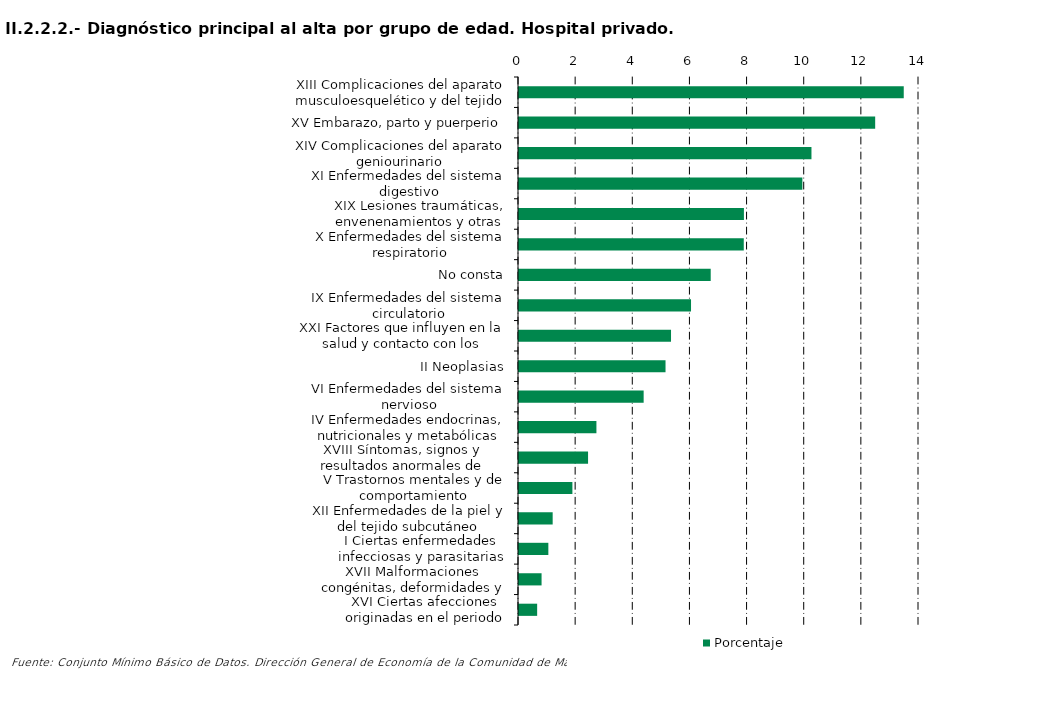
| Category | Porcentaje |
|---|---|
| XIII Complicaciones del aparato musculoesquelético y del tejido conectivo | 13.466 |
| XV Embarazo, parto y puerperio | 12.466 |
| XIV Complicaciones del aparato geniourinario | 10.236 |
| XI Enfermedades del sistema digestivo | 9.918 |
| XIX Lesiones traumáticas, envenenamientos y otras consecuencias de causas externas | 7.872 |
| X Enfermedades del sistema respiratorio | 7.867 |
| No consta | 6.71 |
| IX Enfermedades del sistema circulatorio | 6.021 |
| XXI Factores que influyen en la salud y contacto con los servicios sanitarios | 5.321 |
| II Neoplasias | 5.128 |
| VI Enfermedades del sistema nervioso | 4.363 |
| IV Enfermedades endocrinas, nutricionales y metabólicas | 2.71 |
| XVIII Síntomas, signos y resultados anormales de pruebas complementarias, no clasificados bajo otro concepto | 2.417 |
| V Trastornos mentales y de comportamiento | 1.869 |
| XII Enfermedades de la piel y del tejido subcutáneo | 1.178 |
| I Ciertas enfermedades infecciosas y parasitarias | 1.027 |
| XVII Malformaciones congénitas, deformidades y anomalías cromosómicas | 0.79 |
| XVI Ciertas afecciones originadas en el periodo perinatal | 0.635 |